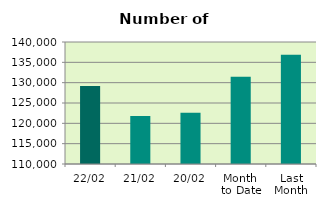
| Category | Series 0 |
|---|---|
| 22/02 | 129170 |
| 21/02 | 121818 |
| 20/02 | 122574 |
| Month 
to Date | 131437.875 |
| Last
Month | 136846.364 |